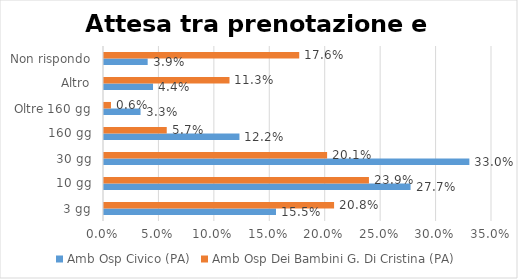
| Category | Amb Osp Civico (PA) | Amb Osp Dei Bambini G. Di Cristina (PA) |
|---|---|---|
| 3 gg | 0.155 | 0.208 |
| 10 gg | 0.277 | 0.239 |
| 30 gg | 0.33 | 0.201 |
| 160 gg | 0.122 | 0.057 |
| Oltre 160 gg | 0.033 | 0.006 |
| Altro | 0.044 | 0.113 |
| Non rispondo | 0.039 | 0.176 |